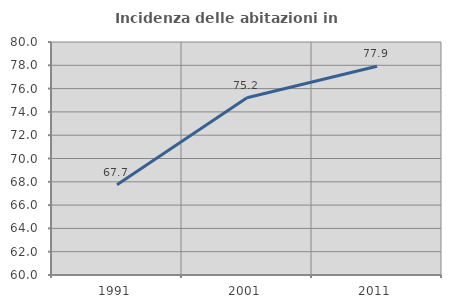
| Category | Incidenza delle abitazioni in proprietà  |
|---|---|
| 1991.0 | 67.747 |
| 2001.0 | 75.212 |
| 2011.0 | 77.913 |